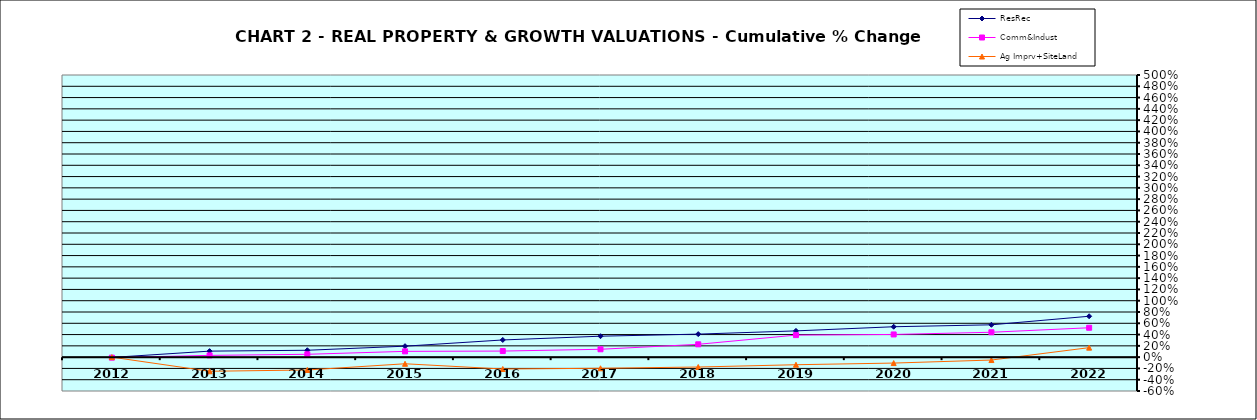
| Category | ResRec | Comm&Indust | Ag Imprv+SiteLand |
|---|---|---|---|
| 2012.0 | -0.005 | -0.009 | 0 |
| 2013.0 | 0.106 | 0.031 | -0.25 |
| 2014.0 | 0.122 | 0.051 | -0.228 |
| 2015.0 | 0.194 | 0.102 | -0.117 |
| 2016.0 | 0.304 | 0.108 | -0.21 |
| 2017.0 | 0.371 | 0.139 | -0.197 |
| 2018.0 | 0.408 | 0.227 | -0.175 |
| 2019.0 | 0.465 | 0.391 | -0.134 |
| 2020.0 | 0.539 | 0.402 | -0.105 |
| 2021.0 | 0.573 | 0.441 | -0.051 |
| 2022.0 | 0.724 | 0.521 | 0.168 |